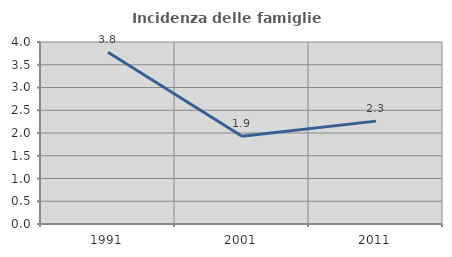
| Category | Incidenza delle famiglie numerose |
|---|---|
| 1991.0 | 3.773 |
| 2001.0 | 1.929 |
| 2011.0 | 2.261 |